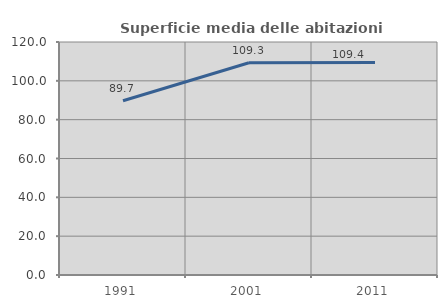
| Category | Superficie media delle abitazioni occupate |
|---|---|
| 1991.0 | 89.734 |
| 2001.0 | 109.282 |
| 2011.0 | 109.395 |